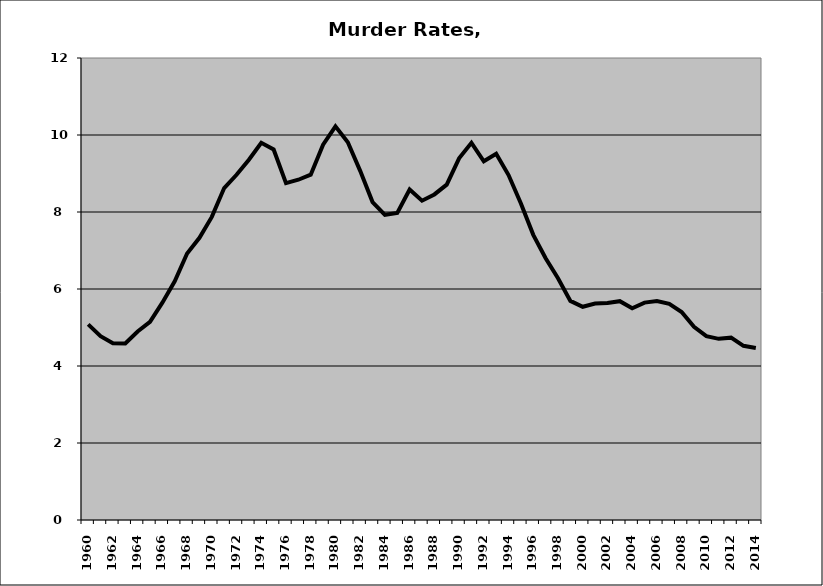
| Category | Murder |
|---|---|
| 1960.0 | 5.08 |
| 1961.0 | 4.776 |
| 1962.0 | 4.592 |
| 1963.0 | 4.584 |
| 1964.0 | 4.897 |
| 1965.0 | 5.147 |
| 1966.0 | 5.645 |
| 1967.0 | 6.199 |
| 1968.0 | 6.921 |
| 1969.0 | 7.329 |
| 1970.0 | 7.873 |
| 1971.0 | 8.622 |
| 1972.0 | 8.966 |
| 1973.0 | 9.359 |
| 1974.0 | 9.797 |
| 1975.0 | 9.624 |
| 1976.0 | 8.749 |
| 1977.0 | 8.838 |
| 1978.0 | 8.97 |
| 1979.0 | 9.75 |
| 1980.0 | 10.224 |
| 1981.0 | 9.814 |
| 1982.0 | 9.069 |
| 1983.0 | 8.259 |
| 1984.0 | 7.926 |
| 1985.0 | 7.976 |
| 1986.0 | 8.584 |
| 1987.0 | 8.294 |
| 1988.0 | 8.456 |
| 1989.0 | 8.711 |
| 1990.0 | 9.395 |
| 1991.0 | 9.797 |
| 1992.0 | 9.317 |
| 1993.0 | 9.514 |
| 1994.0 | 8.96 |
| 1995.0 | 8.221 |
| 1996.0 | 7.407 |
| 1997.0 | 6.8 |
| 1998.0 | 6.281 |
| 1999.0 | 5.692 |
| 2000.0 | 5.538 |
| 2001.0 | 5.621 |
| 2002.0 | 5.636 |
| 2003.0 | 5.684 |
| 2004.0 | 5.499 |
| 2005.0 | 5.646 |
| 2006.0 | 5.688 |
| 2007.0 | 5.613 |
| 2008.0 | 5.402 |
| 2009.0 | 5.016 |
| 2010.0 | 4.777 |
| 2011.0 | 4.705 |
| 2012.0 | 4.736 |
| 2013.0 | 4.524 |
| 2014.0 | 4.469 |